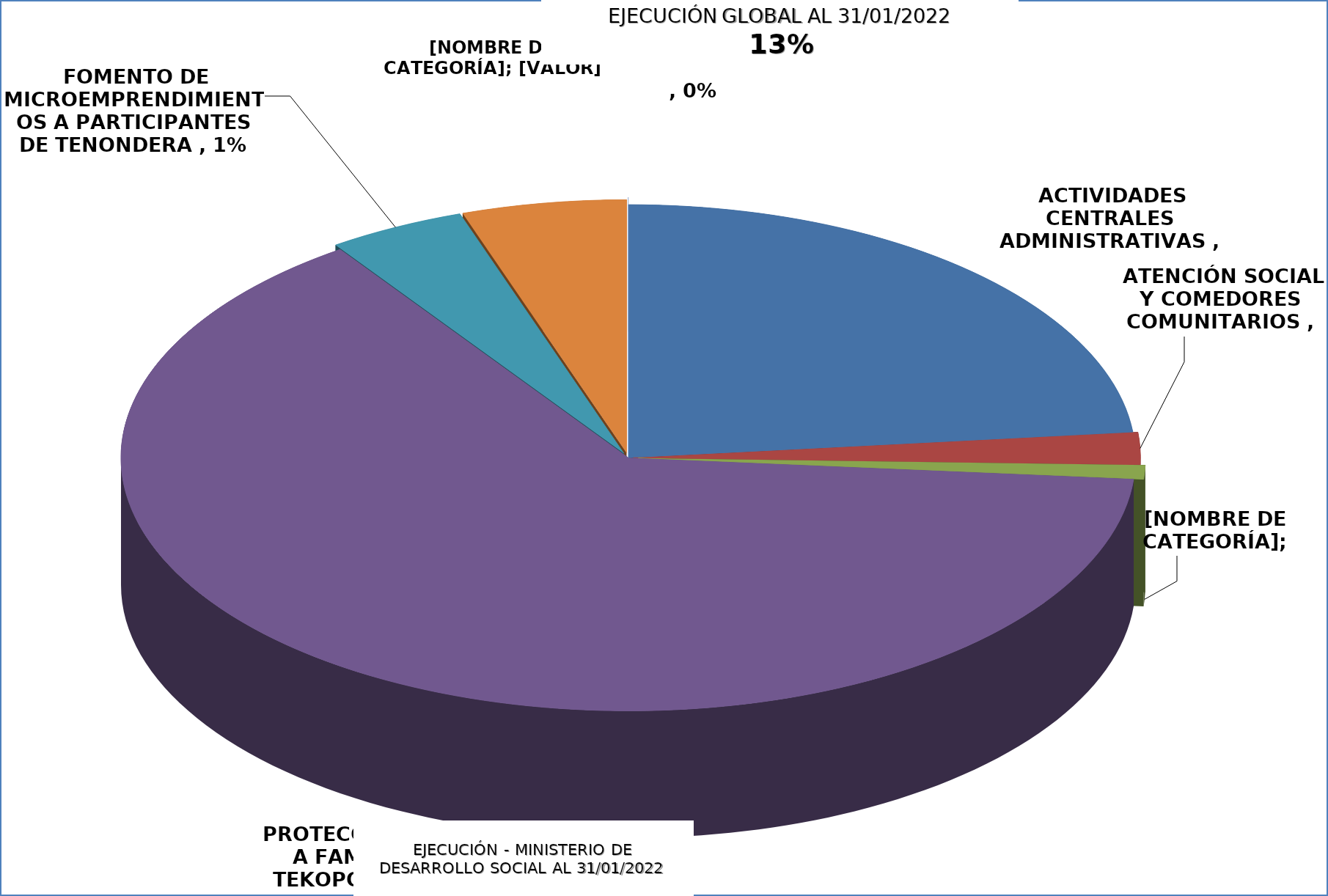
| Category |  EJECUCIÓN - MINISTERIO DE DESARROLLO SOCIAL  |
|---|---|
|  ACTIVIDADES CENTRALES ADMINISTRATIVAS  | 0.055 |
|  ATENCIÓN SOCIAL Y COMEDORES COMUNITARIOS  | 0.005 |
|  ASISTENCIA A PESCADORES POR VEDA PESQUERA  | 0.002 |
|  PROTECCIÓN SOCIAL A FAMILIAS DE TEKOPORA FF10 Y FF20  | 0.151 |
|  FOMENTO DE MICROEMPRENDIMIENTOS A PARTICIPANTES DE TENONDERA  | 0.01 |
|  REGULARIZACIÓN DE TERRITORIOS SOCIALES, TEKOHA  | 0.012 |